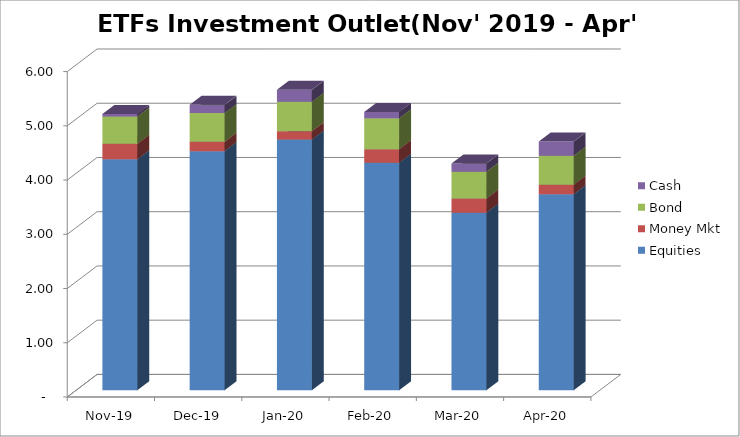
| Category | Equities | Money Mkt | Bond | Cash |
|---|---|---|---|---|
| 2019-11-01 | 4258053610.08 | 285466996.9 | 503321320.85 | 44585809.67 |
| 2019-12-01 | 4408225444.33 | 171857896.38 | 529473292.36 | 151803547.97 |
| 2020-01-01 | 4620730446.19 | 152280847.14 | 544105837.98 | 221324761.76 |
| 2020-02-01 | 4193271504.52 | 252081379.79 | 568973079.15 | 116675921.8 |
| 2020-03-01 | 3274342665.32 | 259460908.27 | 495910824.65 | 150095912.89 |
| 2020-04-01 | 3614392230.14 | 175752553.41 | 535087967.52 | 260113227.03 |